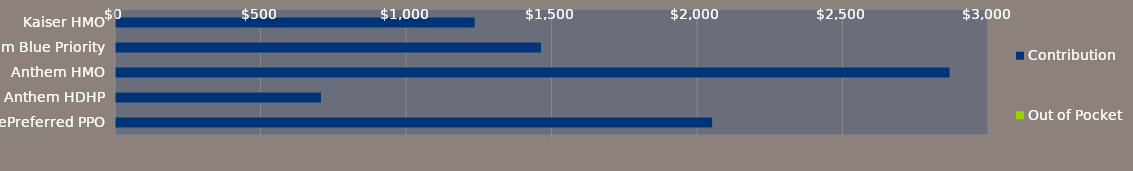
| Category | Contribution | Out of Pocket | #REF! |
|---|---|---|---|
| Kaiser HMO | 1236 | 0 |  |
| Anthem Blue Priority | 1464 | 0 |  |
| Anthem HMO | 2868 | 0 |  |
| Anthem HDHP | 708 | 0 |  |
| BluePreferred PPO | 2052 | 0 |  |